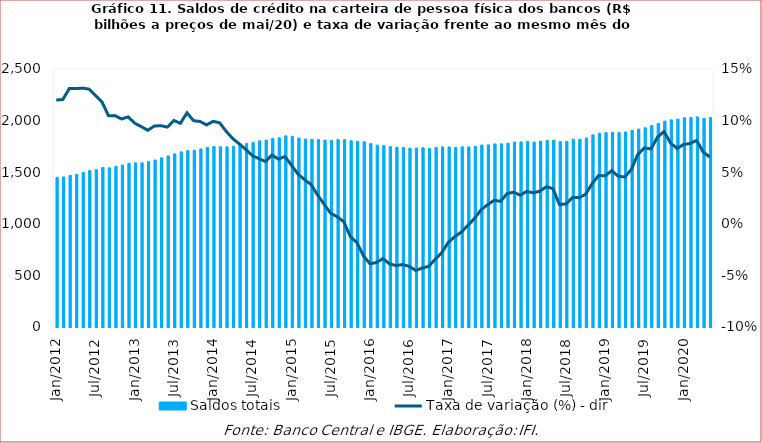
| Category | Saldos totais |
|---|---|
| 2012-01-01 | 1449613.856 |
| 2012-02-01 | 1453935.169 |
| 2012-03-01 | 1469465.388 |
| 2012-04-01 | 1478017.554 |
| 2012-05-01 | 1497099.101 |
| 2012-06-01 | 1516202.22 |
| 2012-07-01 | 1524966.104 |
| 2012-08-01 | 1546525.546 |
| 2012-09-01 | 1542405.074 |
| 2012-10-01 | 1557077.853 |
| 2012-11-01 | 1569674.296 |
| 2012-12-01 | 1587203.518 |
| 2013-01-01 | 1590926.478 |
| 2013-02-01 | 1590883.671 |
| 2013-03-01 | 1602591.173 |
| 2013-04-01 | 1618034.961 |
| 2013-05-01 | 1639499.07 |
| 2013-06-01 | 1658302.528 |
| 2013-07-01 | 1677641.889 |
| 2013-08-01 | 1697149.121 |
| 2013-09-01 | 1708209.331 |
| 2013-10-01 | 1712703.778 |
| 2013-11-01 | 1725282.749 |
| 2013-12-01 | 1739331.178 |
| 2014-01-01 | 1748865.162 |
| 2014-02-01 | 1746613.813 |
| 2014-03-01 | 1746219.346 |
| 2014-04-01 | 1751643.982 |
| 2014-05-01 | 1766509.11 |
| 2014-06-01 | 1777711.694 |
| 2014-07-01 | 1788645.863 |
| 2014-08-01 | 1804364.542 |
| 2014-09-01 | 1811262.216 |
| 2014-10-01 | 1826715.928 |
| 2014-11-01 | 1833500.506 |
| 2014-12-01 | 1852684.984 |
| 2015-01-01 | 1848157.486 |
| 2015-02-01 | 1830542.482 |
| 2015-03-01 | 1821022.474 |
| 2015-04-01 | 1818293.486 |
| 2015-05-01 | 1815599.125 |
| 2015-06-01 | 1811320.722 |
| 2015-07-01 | 1806870.461 |
| 2015-08-01 | 1816630.37 |
| 2015-09-01 | 1814745.28 |
| 2015-10-01 | 1804262.362 |
| 2015-11-01 | 1800074.616 |
| 2015-12-01 | 1795302.874 |
| 2016-01-01 | 1776569.566 |
| 2016-02-01 | 1761780.124 |
| 2016-03-01 | 1759740.664 |
| 2016-04-01 | 1747678.893 |
| 2016-05-01 | 1742083.229 |
| 2016-06-01 | 1739907.6 |
| 2016-07-01 | 1732472.207 |
| 2016-08-01 | 1734533.384 |
| 2016-09-01 | 1736970.829 |
| 2016-10-01 | 1729934.555 |
| 2016-11-01 | 1738356.052 |
| 2016-12-01 | 1745262.466 |
| 2017-01-01 | 1744600.326 |
| 2017-02-01 | 1739946.465 |
| 2017-03-01 | 1745694.242 |
| 2017-04-01 | 1745130.548 |
| 2017-05-01 | 1750943.632 |
| 2017-06-01 | 1763472.593 |
| 2017-07-01 | 1764391.289 |
| 2017-08-01 | 1773962.628 |
| 2017-09-01 | 1774849.225 |
| 2017-10-01 | 1780610.895 |
| 2017-11-01 | 1791556.047 |
| 2017-12-01 | 1793607.491 |
| 2018-01-01 | 1799429.81 |
| 2018-02-01 | 1792202.146 |
| 2018-03-01 | 1800905.709 |
| 2018-04-01 | 1807787.701 |
| 2018-05-01 | 1810572.891 |
| 2018-06-01 | 1796469.134 |
| 2018-07-01 | 1798375.822 |
| 2018-08-01 | 1819346.43 |
| 2018-09-01 | 1819805.415 |
| 2018-10-01 | 1831455.555 |
| 2018-11-01 | 1861322.423 |
| 2018-12-01 | 1877612.421 |
| 2019-01-01 | 1883098.59 |
| 2019-02-01 | 1884444.876 |
| 2019-03-01 | 1883870.302 |
| 2019-04-01 | 1889775.425 |
| 2019-05-01 | 1905776.722 |
| 2019-06-01 | 1917479.704 |
| 2019-07-01 | 1930595.224 |
| 2019-08-01 | 1951318.127 |
| 2019-09-01 | 1972424.956 |
| 2019-10-01 | 1995177.449 |
| 2019-11-01 | 2007279.297 |
| 2019-12-01 | 2014592.209 |
| 2020-01-01 | 2027875.234 |
| 2020-02-01 | 2031076.176 |
| 2020-03-01 | 2036061.492 |
| 2020-04-01 | 2021281.313 |
| 2020-05-01 | 2029024 |